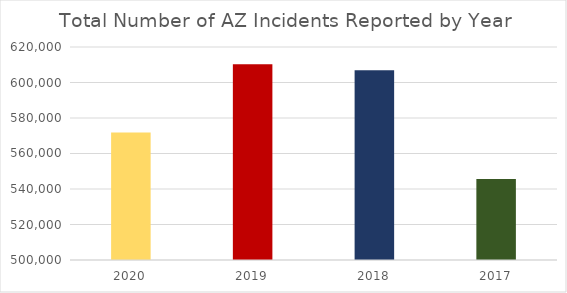
| Category | Total Number of Incidents Reported |
|---|---|
| 2020.0 | 571876 |
| 2019.0 | 610241 |
| 2018.0 | 606894 |
| 2017.0 | 545701 |